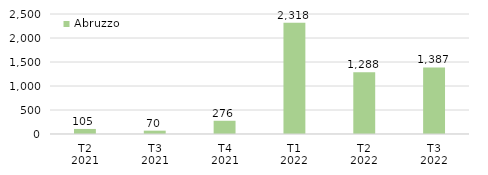
| Category | Abruzzo |
|---|---|
| T2
2021 | 105.385 |
| T3
2021 | 69.533 |
| T4
2021 | 275.728 |
| T1
2022 | 2317.767 |
| T2
2022 | 1288.209 |
| T3
2022 | 1386.533 |